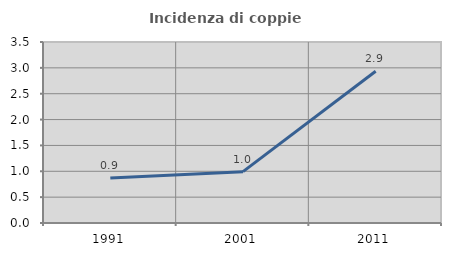
| Category | Incidenza di coppie miste |
|---|---|
| 1991.0 | 0.87 |
| 2001.0 | 0.993 |
| 2011.0 | 2.933 |